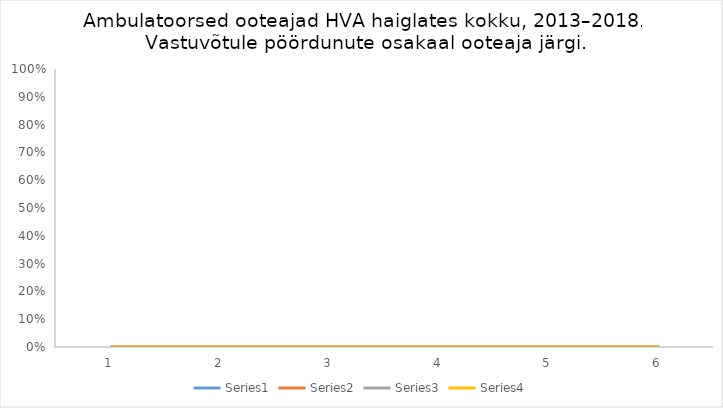
| Category | Series 0 | Series 1 | Series 2 | Series 3 |
|---|---|---|---|---|
| 0 | 0.156 | 0.187 | 0.362 | 0.294 |
| 1 | 0.166 | 0.193 | 0.362 | 0.28 |
| 2 | 0.168 | 0.187 | 0.351 | 0.294 |
| 3 | 0.17 | 0.19 | 0.34 | 0.3 |
| 4 | 0.15 | 0.2 | 0.36 | 0.29 |
| 5 | 0.14 | 0.19 | 0.36 | 0.31 |